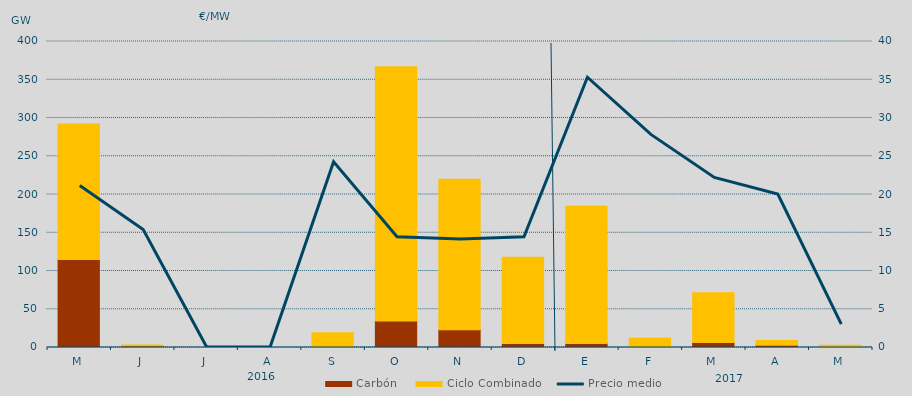
| Category | Carbón | Ciclo Combinado |
|---|---|---|
| M | 115140.8 | 176958.3 |
| J | 1863 | 1250.7 |
| J | 0 | 0 |
| A | 0 | 0 |
| S | 0 | 19356.8 |
| O | 34726.1 | 332294.3 |
| N | 23135.1 | 196729.3 |
| D | 5215.5 | 112859.3 |
| E | 5325.4 | 179227.5 |
| F | 1383.6 | 10714 |
| M | 6612.9 | 64802.4 |
| A | 3055 | 6101.5 |
| M | 341 | 2659 |